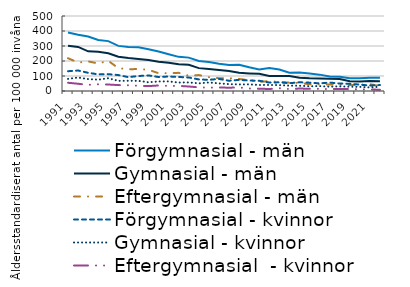
| Category | Förgymnasial - män | Gymnasial - män | Eftergymnasial - män | Förgymnasial - kvinnor | Gymnasial - kvinnor | Eftergymnasial  - kvinnor |
|---|---|---|---|---|---|---|
| 1991.0 | 389.961 | 301.812 | 218.561 | 131.894 | 80.821 | 54.891 |
| 1992.0 | 375.504 | 293.896 | 189.757 | 136.595 | 89.733 | 48.28 |
| 1993.0 | 363.22 | 264.466 | 197.285 | 121.329 | 79.395 | 40.899 |
| 1994.0 | 340.139 | 261.588 | 183.447 | 111.092 | 75.638 | 44.893 |
| 1995.0 | 332.492 | 251.755 | 200.976 | 112.271 | 85.082 | 43.264 |
| 1996.0 | 300.857 | 228.574 | 152.57 | 106.201 | 67.873 | 39.308 |
| 1997.0 | 293.385 | 219.746 | 144.316 | 92.514 | 68.19 | 38.218 |
| 1998.0 | 292.094 | 213.234 | 147.169 | 99.845 | 67.6 | 35.03 |
| 1999.0 | 278.246 | 206.123 | 140.893 | 103.93 | 58.058 | 32.519 |
| 2000.0 | 263.262 | 194.305 | 118.845 | 93.09 | 63.889 | 36.874 |
| 2001.0 | 244.95 | 188.196 | 118.759 | 96.743 | 63.951 | 33.696 |
| 2002.0 | 227.626 | 178.581 | 121.118 | 93.525 | 56.202 | 34.087 |
| 2003.0 | 222.582 | 174.362 | 101.435 | 90.035 | 57.243 | 30.014 |
| 2004.0 | 199.721 | 152.461 | 106.334 | 77.399 | 51.083 | 24.347 |
| 2005.0 | 193.57 | 147.409 | 92.449 | 74.493 | 56.996 | 22.499 |
| 2006.0 | 181.627 | 140.646 | 85.337 | 80.518 | 50.763 | 23.415 |
| 2007.0 | 173.634 | 133.57 | 86.332 | 68.398 | 45.527 | 21.987 |
| 2008.0 | 175.296 | 120.99 | 80.108 | 74.18 | 43.851 | 23.688 |
| 2009.0 | 157.804 | 117.33 | 71.971 | 69.934 | 44.16 | 16.916 |
| 2010.0 | 143.57 | 114.506 | 62.866 | 68.069 | 40.353 | 15.586 |
| 2011.0 | 153.452 | 100.008 | 64.86 | 56.468 | 40.515 | 13.148 |
| 2012.0 | 142.824 | 99.997 | 61.739 | 57.825 | 39.063 | 18.362 |
| 2013.0 | 122.435 | 99.667 | 55.375 | 51.774 | 35.849 | 13.133 |
| 2014.0 | 122.821 | 88.833 | 53.718 | 58.152 | 35.215 | 16.328 |
| 2015.0 | 117.097 | 85.102 | 45.121 | 55.675 | 31.793 | 14.907 |
| 2016.0 | 109.084 | 83.112 | 44.319 | 50.811 | 32.752 | 14.068 |
| 2017.0 | 96.882 | 81.255 | 43.319 | 56.237 | 28.761 | 12.839 |
| 2018.0 | 95.523 | 80.424 | 41.67 | 49.76 | 30.937 | 14.158 |
| 2019.0 | 84.42 | 65.33 | 39.251 | 48.368 | 28.364 | 12.944 |
| 2020.0 | 85.06 | 62.657 | 40.48 | 42.473 | 27.711 | 11.198 |
| 2021.0 | 88.209 | 66.743 | 45.439 | 36.411 | 23.84 | 10.894 |
| 2022.0 | 87.831 | 64.389 | 32.789 | 39.603 | 28.43 | 7.879 |